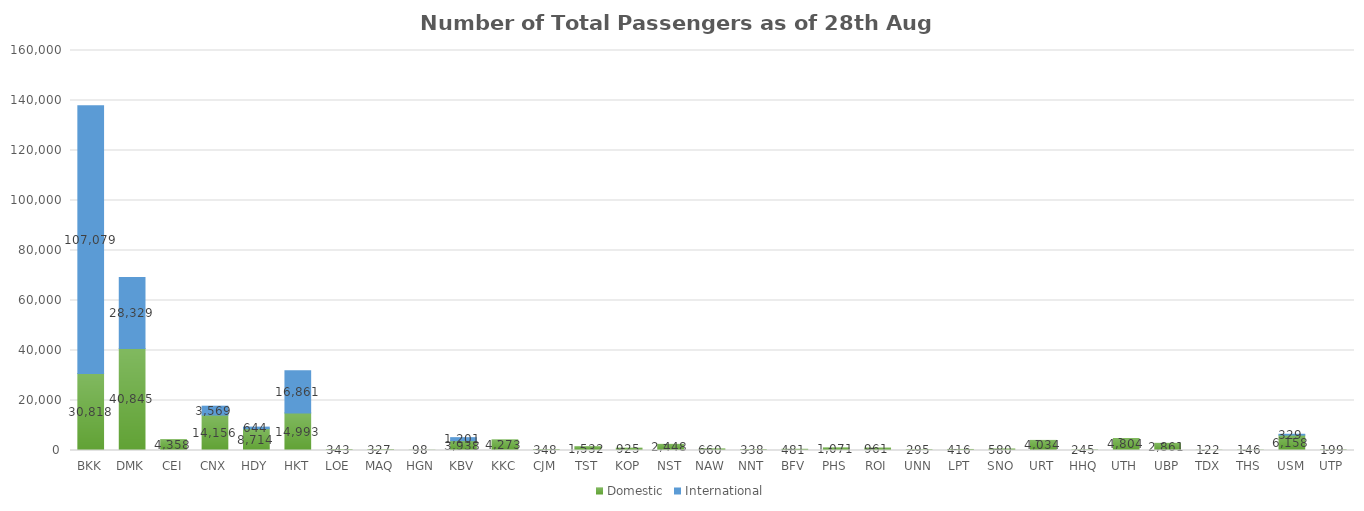
| Category | Domestic | International |
|---|---|---|
| BKK | 30818 | 107079 |
| DMK | 40845 | 28329 |
| CEI | 4358 | 0 |
| CNX | 14156 | 3569 |
| HDY | 8714 | 644 |
| HKT | 14993 | 16861 |
| LOE | 343 | 0 |
| MAQ | 327 | 0 |
| HGN | 98 | 0 |
| KBV | 3938 | 1201 |
| KKC | 4273 | 0 |
| CJM | 348 | 0 |
| TST | 1532 | 0 |
| KOP | 925 | 0 |
| NST | 2448 | 0 |
| NAW | 660 | 0 |
| NNT | 338 | 0 |
| BFV | 481 | 0 |
| PHS | 1071 | 0 |
| ROI | 961 | 0 |
| UNN | 295 | 0 |
| LPT | 416 | 0 |
| SNO | 580 | 0 |
| URT | 4034 | 0 |
| HHQ | 245 | 0 |
| UTH | 4804 | 0 |
| UBP | 2861 | 0 |
| TDX | 122 | 0 |
| THS | 146 | 0 |
| USM | 6158 | 329 |
| UTP | 199 | 0 |